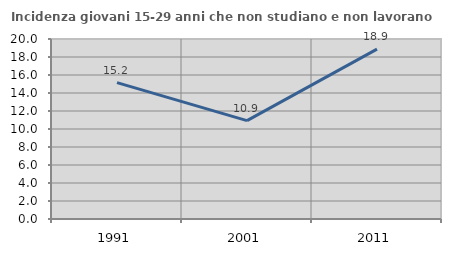
| Category | Incidenza giovani 15-29 anni che non studiano e non lavorano  |
|---|---|
| 1991.0 | 15.152 |
| 2001.0 | 10.924 |
| 2011.0 | 18.881 |